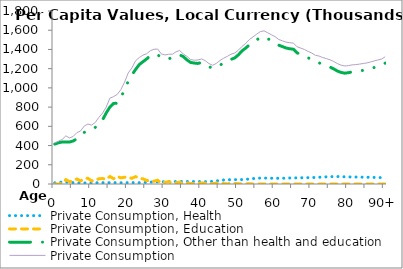
| Category | Private Consumption, Health | Private Consumption, Education | Private Consumption, Other than health and education | Private Consumption |
|---|---|---|---|---|
| 0 | 11962.731 | 0 | 415241.005 | 427203.73 |
|  | 17032.555 | 0 | 428918.336 | 445950.89 |
| 2 | 19820.257 | 6236.09 | 437139.489 | 463195.84 |
| 3 | 19876.286 | 45269.437 | 435998.635 | 501144.36 |
| 4 | 17567.573 | 24401.654 | 436851.681 | 478820.91 |
| 5 | 14488.316 | 33125.753 | 447717.003 | 495331.07 |
| 6 | 12063.76 | 52214.461 | 470228.232 | 534506.46 |
| 7 | 11611.151 | 31615.037 | 507825.173 | 551051.36 |
| 8 | 11433.087 | 54631.578 | 536854.273 | 602918.94 |
| 9 | 11313.302 | 59715.839 | 553064.633 | 624093.78 |
| 10 | 10875.699 | 32288.063 | 569772.482 | 612936.24 |
| 11 | 11799.448 | 39380.91 | 588604.74 | 639785.1 |
| 12 | 13786.005 | 54253.107 | 625658.71 | 693697.83 |
| 13 | 13994.565 | 57603.13 | 665723.935 | 737321.63 |
| 14 | 13909.89 | 47111.862 | 739652.49 | 800674.24 |
| 15 | 13974.251 | 78451.675 | 800456.76 | 892882.68 |
| 16 | 14833.423 | 55410.014 | 838803.61 | 909047.05 |
| 17 | 13474.954 | 79421.015 | 839008.73 | 931904.7 |
| 18 | 13079.414 | 63580.145 | 905720.2 | 982379.76 |
| 19 | 12874.296 | 70336.59 | 976856.23 | 1060067.1 |
| 20 | 14634.744 | 71086.615 | 1070409.04 | 1156130.4 |
| 21 | 14694.974 | 58722.606 | 1134358.55 | 1207776.1 |
| 22 | 13832.22 | 77069.537 | 1191620.71 | 1282522.5 |
| 23 | 13560.577 | 59310.668 | 1242335.97 | 1315207.2 |
| 24 | 14729.815 | 53940.37 | 1272228.25 | 1340898.4 |
| 25 | 16996.781 | 37133.332 | 1300441.24 | 1354571.4 |
| 26 | 19645.46 | 31022.14 | 1335611.26 | 1386278.8 |
| 27 | 21433.358 | 29058.624 | 1351345.61 | 1401837.6 |
| 28 | 22710.051 | 39103.529 | 1342579.58 | 1404393.2 |
| 29 | 23430.593 | 9535.755 | 1321054.46 | 1354020.8 |
| 30 | 23351.768 | 17492.704 | 1301883.62 | 1342728.1 |
| 31 | 24082.142 | 24705.562 | 1301614.67 | 1350402.4 |
| 32 | 25232.128 | 7285.779 | 1317620.15 | 1350138.1 |
| 33 | 25579.647 | 11560.193 | 1337669.88 | 1374809.7 |
| 34 | 25720.772 | 19747.154 | 1343761.88 | 1389229.8 |
| 35 | 26237.364 | 1729.033 | 1325401.04 | 1353367.4 |
| 36 | 25962.289 | 11035.503 | 1290995.79 | 1327993.6 |
| 37 | 25451.328 | 4993.873 | 1264493.6 | 1294938.8 |
| 38 | 25540.689 | 4066.599 | 1258241.03 | 1287848.3 |
| 39 | 26005.116 | 10014.064 | 1254508.57 | 1290527.7 |
| 40 | 25540.729 | 11505.309 | 1264139.03 | 1301185 |
| 41 | 24724.145 | 9487.455 | 1248034.56 | 1282246.1 |
| 42 | 25033.409 | 7074.651 | 1220653.47 | 1252761.6 |
| 43 | 28096.062 | 2409.098 | 1204813.48 | 1235318.6 |
| 44 | 32051.193 | 9792.006 | 1212895.6 | 1254738.8 |
| 45 | 36317.945 | 14036.551 | 1234726.52 | 1285081.1 |
| 46 | 41443.47 | 4638.058 | 1263207.62 | 1309289.2 |
| 47 | 43699.822 | 335.533 | 1283978.12 | 1328013.4 |
| 48 | 44621.795 | 9604.962 | 1296427.73 | 1350654.4 |
| 49 | 45335.278 | 5425.96 | 1311607.4 | 1362368.6 |
| 50 | 45782.766 | 3213.873 | 1343270.67 | 1392267.3 |
| 51 | 46121.321 | 0 | 1385343.84 | 1431465.2 |
| 52 | 48289.663 | 1353.604 | 1414031.61 | 1463674.9 |
| 53 | 52349.234 | 3168.694 | 1447866.81 | 1503384.8 |
| 54 | 56121.926 | 0 | 1474486.76 | 1530608.7 |
| 55 | 59398.179 | 0 | 1499855.29 | 1559253.4 |
| 56 | 61669.885 | 0 | 1524030.34 | 1585700.2 |
| 57 | 62261.868 | 0 | 1531249.78 | 1593511.6 |
| 58 | 61049.695 | 66.119 | 1511978.62 | 1573094.4 |
| 59 | 59991.97 | 518.693 | 1492583.27 | 1553093.9 |
| 60 | 59629.214 | 166.722 | 1473053.11 | 1532849.1 |
| 61 | 59481.261 | 0 | 1444170.11 | 1503651.3 |
| 62 | 59878.125 | 0 | 1429781.14 | 1489659.2 |
| 63 | 60908.745 | 0 | 1415095.87 | 1476004.6 |
| 64 | 62447.086 | 0 | 1407275.94 | 1469723 |
| 65 | 64025.136 | 0 | 1402242.53 | 1466267.7 |
| 66 | 63379.46 | 0 | 1364155.47 | 1427534.9 |
| 67 | 64525.995 | 0 | 1349567.49 | 1414093.5 |
| 68 | 65482.761 | 0 | 1334115.86 | 1399598.6 |
| 69 | 66043.922 | 0 | 1313367.14 | 1379411.1 |
| 70 | 67143.852 | 0 | 1295361.59 | 1362505.4 |
| 71 | 68211.73 | 0 | 1271319.26 | 1339531 |
| 72 | 70375.412 | 0 | 1260723.88 | 1331099.3 |
| 73 | 72418.892 | 0 | 1243114.37 | 1315533.3 |
| 74 | 74412.468 | 0 | 1230146.42 | 1304558.9 |
| 75 | 76169.161 | 0 | 1215719.55 | 1291888.7 |
| 76 | 77417.574 | 0 | 1197290.5 | 1274708.1 |
| 77 | 77785.626 | 0 | 1174737.36 | 1252523 |
| 78 | 75819.877 | 0 | 1160848.71 | 1236668.6 |
| 79 | 74605.412 | 0 | 1153014.35 | 1227619.8 |
| 80 | 73730.861 | 0 | 1158325.96 | 1232056.8 |
| 81 | 73145.602 | 0 | 1166262.74 | 1239408.3 |
| 82 | 72435.679 | 0 | 1169795.83 | 1242231.5 |
| 83 | 71738.715 | 0 | 1175649.9 | 1247388.6 |
| 84 | 71089.245 | 0 | 1182804.71 | 1253893.9 |
| 85 | 70333.259 | 0 | 1189420.23 | 1259753.5 |
| 86 | 69349.574 | 0 | 1199833.48 | 1269183 |
| 87 | 68369.417 | 0 | 1211848.92 | 1280218.3 |
| 88 | 67441.094 | 0 | 1222421.51 | 1289862.6 |
| 89 | 66527.35 | 0 | 1234028.55 | 1300555.9 |
| 90+ | 65708.967 | 0 | 1257279.73 | 1322988.7 |